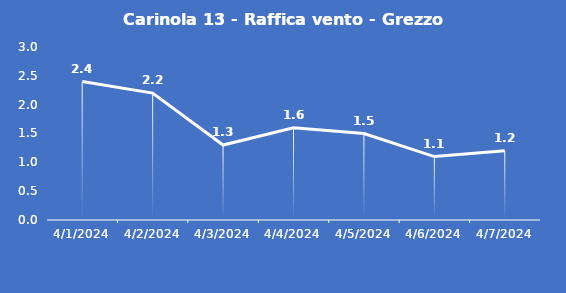
| Category | Carinola 13 - Raffica vento - Grezzo (m/s) |
|---|---|
| 4/1/24 | 2.4 |
| 4/2/24 | 2.2 |
| 4/3/24 | 1.3 |
| 4/4/24 | 1.6 |
| 4/5/24 | 1.5 |
| 4/6/24 | 1.1 |
| 4/7/24 | 1.2 |